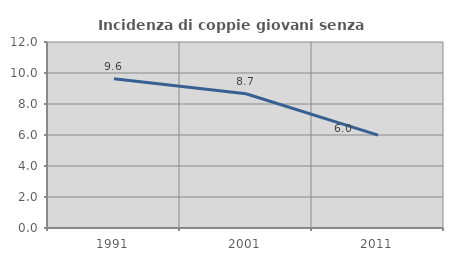
| Category | Incidenza di coppie giovani senza figli |
|---|---|
| 1991.0 | 9.622 |
| 2001.0 | 8.661 |
| 2011.0 | 5.996 |